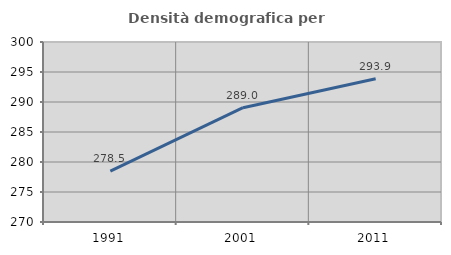
| Category | Densità demografica |
|---|---|
| 1991.0 | 278.466 |
| 2001.0 | 289.05 |
| 2011.0 | 293.885 |